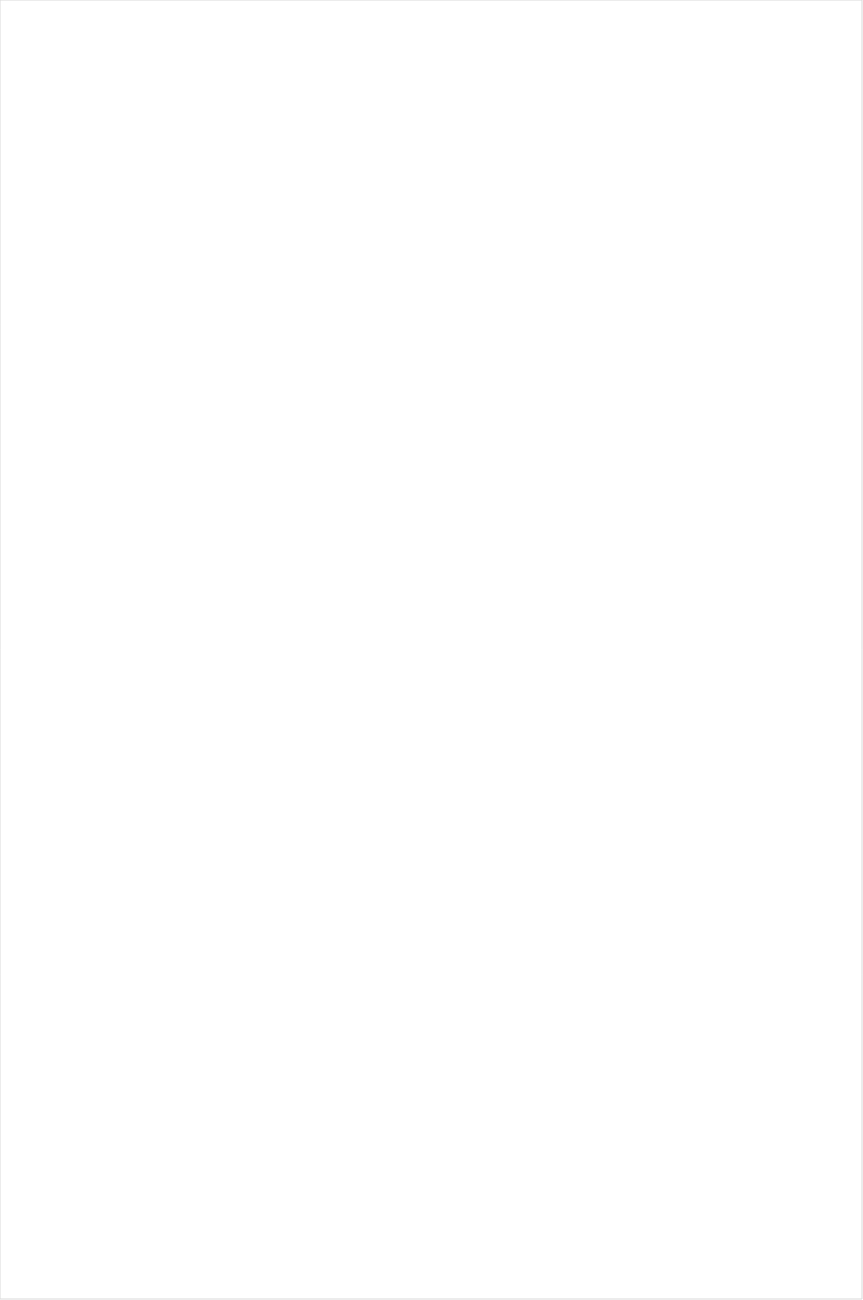
| Category | Total |
|---|---|
| BET | -0.486 |
| BET Her | -0.483 |
| TV ONE | -0.455 |
| Lifetime Movies | -0.439 |
| MyNetworkTV | -0.417 |
| VH1 | -0.401 |
| MTV2 | -0.391 |
| Nick Toons | -0.391 |
| Oprah Winfrey Network | -0.364 |
| UniMas | -0.35 |
| TLC | -0.321 |
| Univision | -0.319 |
| Disney XD | -0.309 |
| WE TV | -0.301 |
| Discovery Life Channel | -0.278 |
| Travel | -0.273 |
| Adult Swim | -0.27 |
| UP TV | -0.267 |
| Telemundo | -0.261 |
| Nick | -0.255 |
| Disney Channel | -0.23 |
| NBC Universo | -0.209 |
| Lifetime | -0.186 |
| Hallmark Movies & Mysteries | -0.182 |
| ION | -0.176 |
| Hallmark | -0.171 |
| Investigation Discovery | -0.157 |
| Nick Jr. | -0.149 |
| Universal Kids | -0.133 |
| E! | -0.129 |
| Teen Nick | -0.118 |
| Galavision | -0.113 |
| TUDN | -0.108 |
| Disney Junior US | -0.096 |
| FX | -0.057 |
| Headline News | -0.05 |
| Discovery Family Channel | -0.034 |
| CW | -0.034 |
| OXYGEN | -0.032 |
| Nick@Nite | -0.029 |
| BRAVO | -0.026 |
| CBS | -0.026 |
| Ovation | -0.011 |
| A&E | -0.008 |
| Logo | 0.01 |
| INSP | 0.016 |
| SYFY | 0.028 |
| CMTV | 0.028 |
| POP | 0.041 |
| Discovery Channel | 0.043 |
| MTV | 0.056 |
| NBC | 0.057 |
| HGTV | 0.058 |
| Science Channel | 0.07 |
| ABC | 0.079 |
| Animal Planet | 0.111 |
| Motor Trend Network | 0.138 |
| Great American Country | 0.142 |
| History Channel | 0.147 |
| USA Network | 0.148 |
| FOX | 0.153 |
| MSNBC | 0.157 |
| TBS | 0.171 |
| FXX | 0.21 |
| SundanceTV | 0.213 |
| FX Movie Channel | 0.22 |
| TNT | 0.221 |
| National Geographic Wild | 0.24 |
| PBS | 0.24 |
| Freeform | 0.241 |
| Paramount Network | 0.244 |
| National Geographic | 0.244 |
| Destination America | 0.254 |
| WGN America | 0.269 |
| CNN | 0.282 |
| FYI | 0.287 |
| Food Network | 0.289 |
| Reelz Channel | 0.298 |
| DIY | 0.309 |
| TV LAND | 0.312 |
| Fox Business | 0.355 |
| truTV | 0.391 |
| Weather Channel | 0.393 |
| Cartoon Network | 0.418 |
| Viceland | 0.427 |
| Fox News | 0.43 |
| AMC | 0.438 |
| Cooking Channel | 0.457 |
| BBC America | 0.464 |
| American Heroes Channel | 0.478 |
| Game Show | 0.494 |
| CNBC | 0.501 |
| Outdoor Channel | 0.51 |
| Comedy Central | 0.513 |
| RFD TV | 0.518 |
| Independent Film (IFC) | 0.62 |
| The Sportsman Channel | 0.621 |
| Smithsonian | 0.625 |
| Bloomberg HD | 0.638 |
| Olympic Channel | 0.95 |
| FXDEP | 1.101 |
| Tennis Channel | 1.128 |
| NBA TV | 1.346 |
| NBC Sports | 1.454 |
| CBS Sports | 1.56 |
| NFL Network | 1.577 |
| ESPN Deportes | 1.608 |
| Fox Sports 1 | 1.678 |
| Big Ten Network | 1.723 |
| FOX Sports 2 | 1.908 |
| ESPNEWS | 1.916 |
| PAC-12 Network | 1.999 |
| Golf | 2.032 |
| ESPN | 2.122 |
| NHL | 2.39 |
| ESPNU | 2.761 |
| ESPN2 | 2.798 |
| MLB Network | 5.289 |